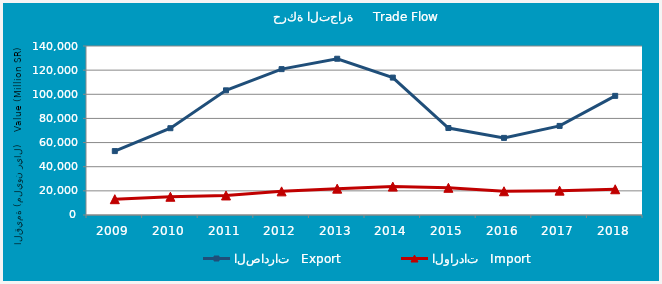
| Category | الصادرات   Export | الواردات   Import |
|---|---|---|
| 2009.0 | 52950632446 | 13094504997 |
| 2010.0 | 71891265072 | 15116181988 |
| 2011.0 | 103271729813 | 16191118313 |
| 2012.0 | 120840682120 | 19580943752 |
| 2013.0 | 129444087040 | 21821667021 |
| 2014.0 | 113828373160 | 23508543092 |
| 2015.0 | 72052057139 | 22532077423 |
| 2016.0 | 63879803613 | 19662468637 |
| 2017.0 | 73801213531 | 20175674622 |
| 2018.0 | 98689367161 | 21322415535 |